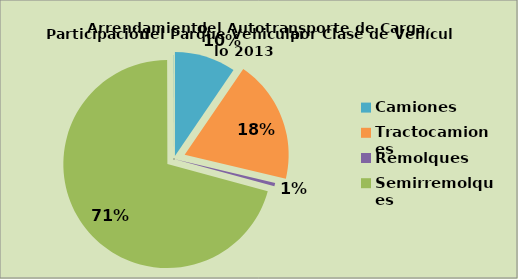
| Category | Series 0 |
|---|---|
| Camiones | 9.526 |
| Tractocamiones | 19.178 |
| Remolques | 0.521 |
| Semirremolques | 70.736 |
| Otros | 0.04 |